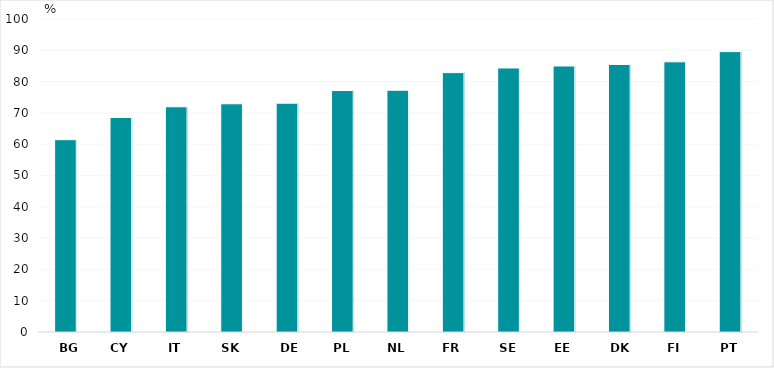
| Category | My parents support my educational efforts and achievements |
|---|---|
| BG | 61.449 |
| CY | 68.539 |
| IT | 71.952 |
| SK | 72.917 |
| DE | 73.105 |
| PL | 77.144 |
| NL | 77.246 |
| FR | 82.869 |
| SE | 84.354 |
| EE | 84.987 |
| DK | 85.472 |
| FI | 86.322 |
| PT | 89.58 |